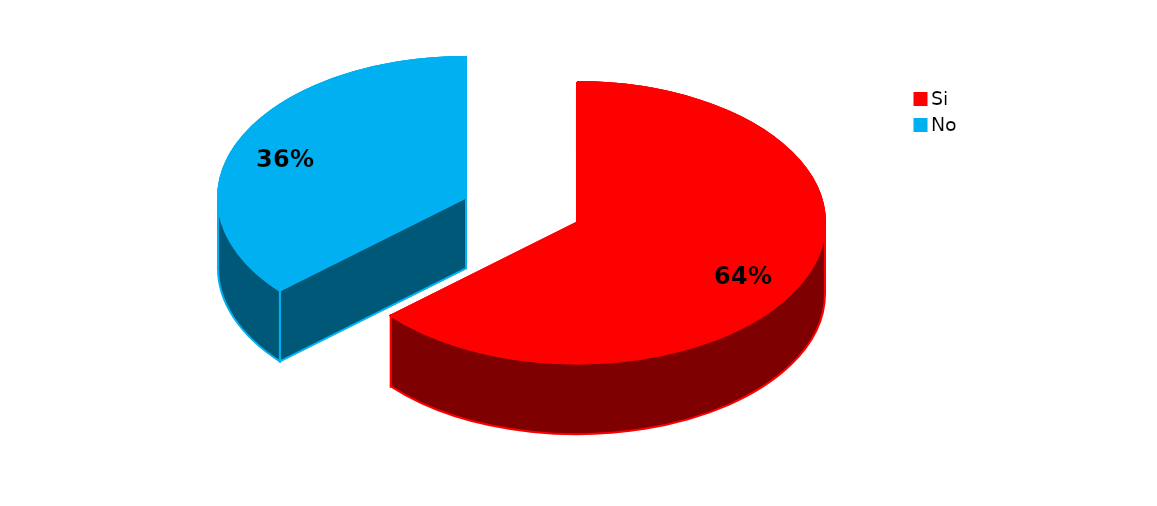
| Category | Series 0 |
|---|---|
| Si | 47 |
| No | 27 |